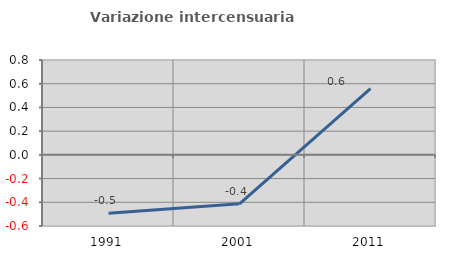
| Category | Variazione intercensuaria annua |
|---|---|
| 1991.0 | -0.492 |
| 2001.0 | -0.412 |
| 2011.0 | 0.559 |